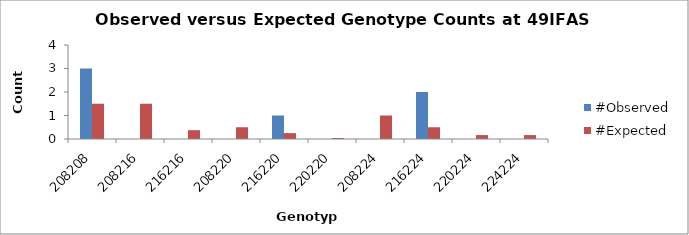
| Category | #Observed | #Expected |
|---|---|---|
| 208208.0 | 3 | 1.5 |
| 208216.0 | 0 | 1.5 |
| 216216.0 | 0 | 0.375 |
| 208220.0 | 0 | 0.5 |
| 216220.0 | 1 | 0.25 |
| 220220.0 | 0 | 0.042 |
| 208224.0 | 0 | 1 |
| 216224.0 | 2 | 0.5 |
| 220224.0 | 0 | 0.167 |
| 224224.0 | 0 | 0.167 |